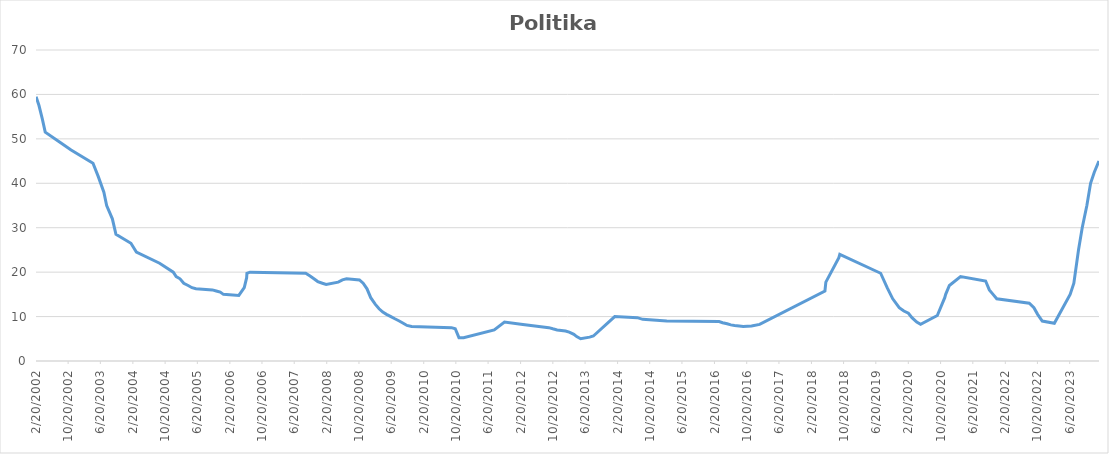
| Category | Politika Faizi |
|---|---|
| 2/20/02 | 59.5 |
| 3/14/02 | 57.5 |
| 4/8/02 | 54.5 |
| 4/30/02 | 51.5 |
| 8/5/02 | 49.5 |
| 11/11/02 | 47.5 |
| 4/25/03 | 44.5 |
| 6/4/03 | 41.5 |
| 7/16/03 | 38 |
| 8/6/03 | 35 |
| 9/18/03 | 32 |
| 10/15/03 | 28.5 |
| 2/5/04 | 26.5 |
| 3/17/04 | 24.5 |
| 9/8/04 | 22 |
| 12/20/04 | 20 |
| 1/11/05 | 19 |
| 2/9/05 | 18.5 |
| 3/9/05 | 17.5 |
| 4/11/05 | 17 |
| 5/10/05 | 16.5 |
| 6/9/05 | 16.25 |
| 10/11/05 | 16 |
| 11/9/05 | 15.75 |
| 12/9/05 | 15.5 |
| 1/2/06 | 15 |
| 4/28/06 | 14.75 |
| 6/8/06 | 16.5 |
| 6/26/06 | 18.75 |
| 6/28/06 | 19.75 |
| 7/21/06 | 20 |
| 9/14/07 | 19.75 |
| 10/17/07 | 19.125 |
| 11/15/07 | 18.5 |
| 12/14/07 | 17.875 |
| 1/18/08 | 17.5 |
| 2/15/08 | 17.25 |
| 5/16/08 | 17.75 |
| 6/17/08 | 18.25 |
| 7/18/08 | 18.5 |
| 10/23/08 | 18.25 |
| 11/20/08 | 17.5 |
| 12/19/08 | 16.25 |
| 1/16/09 | 14.25 |
| 2/20/09 | 12.75 |
| 3/20/09 | 11.75 |
| 4/17/09 | 11 |
| 5/15/09 | 10.5 |
| 6/17/09 | 10 |
| 7/17/09 | 9.5 |
| 8/19/09 | 9 |
| 9/18/09 | 8.5 |
| 10/16/09 | 8 |
| 11/20/09 | 7.75 |
| 9/17/10 | 7.5 |
| 10/15/10 | 7.25 |
| 11/12/10 | 5.25 |
| 12/17/10 | 5.25 |
| 8/5/11 | 7 |
| 10/21/11 | 8.75 |
| 2/22/12 | 8.25 |
| 9/19/12 | 7.5 |
| 10/19/12 | 7.25 |
| 11/21/12 | 7 |
| 1/23/13 | 6.75 |
| 2/20/13 | 6.5 |
| 3/27/13 | 6 |
| 4/17/13 | 5.5 |
| 5/17/13 | 5 |
| 7/24/13 | 5.375 |
| 8/21/13 | 5.625 |
| 1/29/14 | 10 |
| 7/18/14 | 9.75 |
| 8/28/14 | 9.375 |
| 2/25/15 | 9 |
| 3/25/16 | 8.875 |
| 4/21/16 | 8.625 |
| 5/25/16 | 8.375 |
| 6/22/16 | 8.125 |
| 7/20/16 | 8 |
| 8/24/16 | 7.875 |
| 9/23/16 | 7.75 |
| 11/25/16 | 7.875 |
| 1/25/17 | 8.25 |
| 6/1/18 | 15.75 |
| 6/8/18 | 17.75 |
| 9/14/18 | 23.25 |
| 9/21/18 | 24 |
| 7/26/19 | 19.75 |
| 9/13/19 | 16.5 |
| 10/25/19 | 14 |
| 12/13/19 | 12 |
| 1/17/20 | 11.25 |
| 2/20/20 | 10.75 |
| 3/18/20 | 9.75 |
| 4/23/20 | 8.75 |
| 5/22/20 | 8.25 |
| 9/25/20 | 10.25 |
| 11/20/20 | 14.25 |
| 11/27/20 | 15 |
| 12/25/20 | 17 |
| 3/19/21 | 19 |
| 9/24/21 | 18 |
| 10/22/21 | 16 |
| 11/19/21 | 15 |
| 12/17/21 | 14 |
| 8/19/22 | 13 |
| 9/23/22 | 12 |
| 10/21/22 | 10.5 |
| 11/25/22 | 9 |
| 2/24/23 | 8.5 |
| 6/23/23 | 15 |
| 7/21/23 | 17.5 |
| 8/25/23 | 25 |
| 9/22/23 | 30 |
| 10/27/23 | 35 |
| 11/24/23 | 40 |
| 12/22/23 | 42.5 |
| 1/26/24 | 45 |